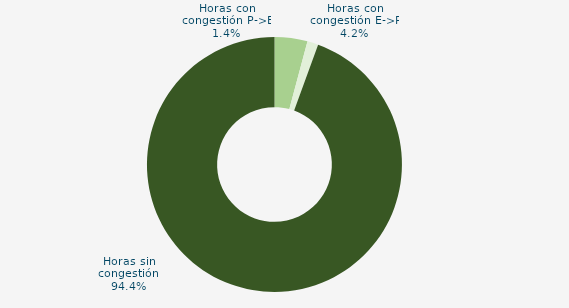
| Category | Horas con congestión E->P |
|---|---|
| Horas con congestión E->P | 4.167 |
| Horas con congestión P->E | 1.389 |
| Horas sin congestión | 94.444 |